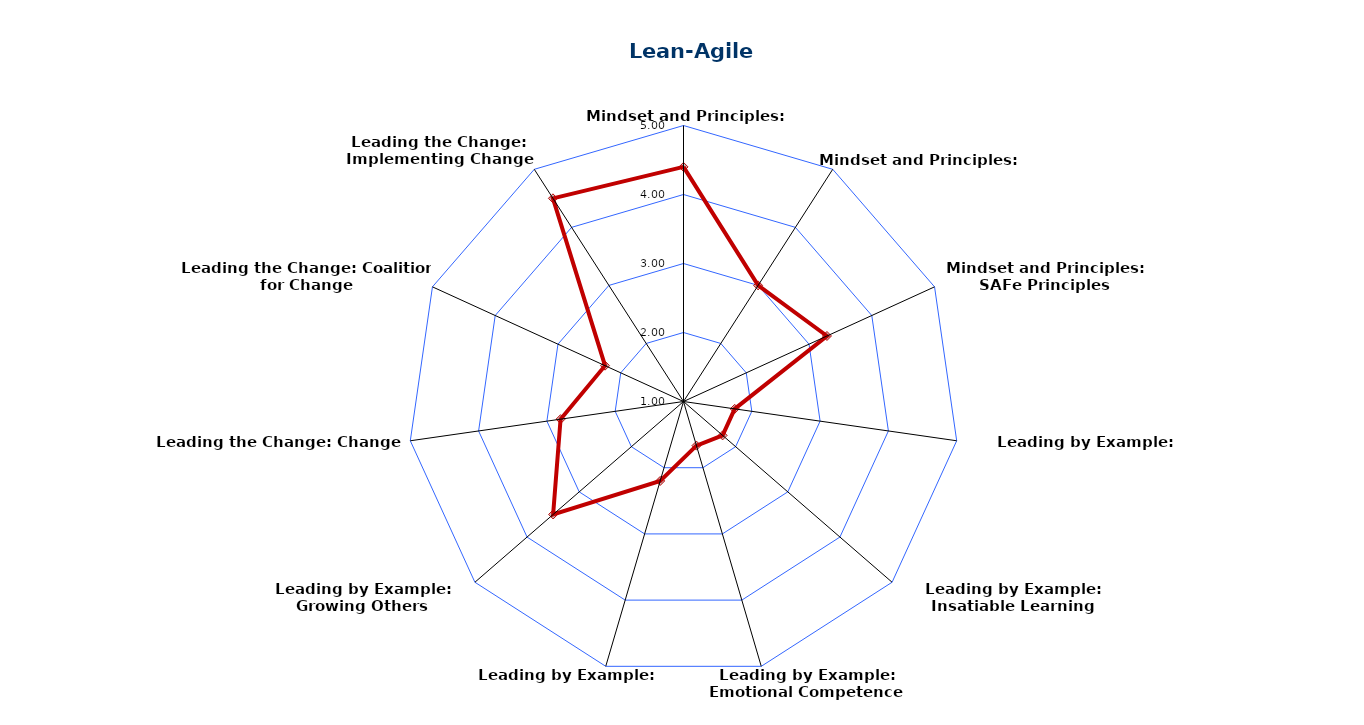
| Category | Series 0 |
|---|---|
| Mindset and Principles: Mindset | 4.4 |
| Mindset and Principles: Values | 3 |
| Mindset and Principles: SAFe Principles | 3.286 |
| Leading by Example: Authenticity | 1.75 |
| Leading by Example: Insatiable Learning | 1.75 |
| Leading by Example: Emotional Competence | 1.667 |
| Leading by Example: Courage | 2.2 |
| Leading by Example: Growing Others | 3.5 |
| Leading the Change: Change Vision | 2.8 |
| Leading the Change: Coalition for Change | 2.25 |
| Leading the Change: Implementing Change | 4.5 |